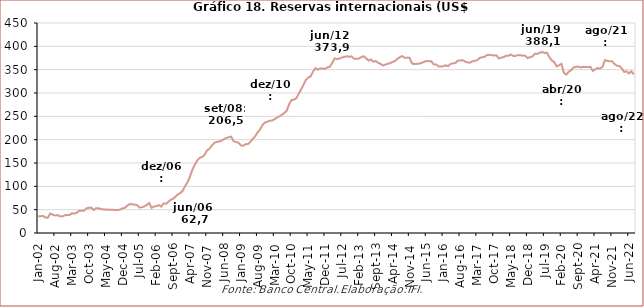
| Category | Reservas internacionais |
|---|---|
| 2002-01-01 | 36.167 |
| 2002-02-01 | 35.906 |
| 2002-03-01 | 36.721 |
| 2002-04-01 | 33.008 |
| 2002-05-01 | 32.889 |
| 2002-06-01 | 41.999 |
| 2002-07-01 | 39.06 |
| 2002-08-01 | 37.643 |
| 2002-09-01 | 38.381 |
| 2002-10-01 | 35.855 |
| 2002-11-01 | 35.592 |
| 2002-12-01 | 37.823 |
| 2003-01-01 | 38.772 |
| 2003-02-01 | 38.53 |
| 2003-03-01 | 42.335 |
| 2003-04-01 | 41.5 |
| 2003-05-01 | 43.373 |
| 2003-06-01 | 47.956 |
| 2003-07-01 | 47.645 |
| 2003-08-01 | 47.793 |
| 2003-09-01 | 52.675 |
| 2003-10-01 | 54.093 |
| 2003-11-01 | 54.427 |
| 2003-12-01 | 49.296 |
| 2004-01-01 | 53.261 |
| 2004-02-01 | 52.96 |
| 2004-03-01 | 51.612 |
| 2004-04-01 | 50.498 |
| 2004-05-01 | 50.54 |
| 2004-06-01 | 49.805 |
| 2004-07-01 | 49.666 |
| 2004-08-01 | 49.594 |
| 2004-09-01 | 49.496 |
| 2004-10-01 | 49.416 |
| 2004-11-01 | 50.133 |
| 2004-12-01 | 52.935 |
| 2005-01-01 | 54.022 |
| 2005-02-01 | 59.017 |
| 2005-03-01 | 61.96 |
| 2005-04-01 | 61.591 |
| 2005-05-01 | 60.709 |
| 2005-06-01 | 59.885 |
| 2005-07-01 | 54.688 |
| 2005-08-01 | 55.076 |
| 2005-09-01 | 57.008 |
| 2005-10-01 | 60.245 |
| 2005-11-01 | 64.277 |
| 2005-12-01 | 53.799 |
| 2006-01-01 | 56.924 |
| 2006-02-01 | 57.415 |
| 2006-03-01 | 59.824 |
| 2006-04-01 | 56.552 |
| 2006-05-01 | 63.381 |
| 2006-06-01 | 62.67 |
| 2006-07-01 | 66.819 |
| 2006-08-01 | 71.478 |
| 2006-09-01 | 73.393 |
| 2006-10-01 | 78.171 |
| 2006-11-01 | 83.114 |
| 2006-12-01 | 85.839 |
| 2007-01-01 | 91.086 |
| 2007-02-01 | 101.07 |
| 2007-03-01 | 109.531 |
| 2007-04-01 | 121.83 |
| 2007-05-01 | 136.419 |
| 2007-06-01 | 147.101 |
| 2007-07-01 | 155.91 |
| 2007-08-01 | 161.097 |
| 2007-09-01 | 162.962 |
| 2007-10-01 | 167.867 |
| 2007-11-01 | 177.06 |
| 2007-12-01 | 180.334 |
| 2008-01-01 | 187.507 |
| 2008-02-01 | 192.902 |
| 2008-03-01 | 195.232 |
| 2008-04-01 | 195.767 |
| 2008-05-01 | 197.906 |
| 2008-06-01 | 200.827 |
| 2008-07-01 | 203.562 |
| 2008-08-01 | 205.116 |
| 2008-09-01 | 206.494 |
| 2008-10-01 | 197.229 |
| 2008-11-01 | 194.668 |
| 2008-12-01 | 193.783 |
| 2009-01-01 | 188.102 |
| 2009-02-01 | 186.88 |
| 2009-03-01 | 190.388 |
| 2009-04-01 | 190.546 |
| 2009-05-01 | 195.264 |
| 2009-06-01 | 201.467 |
| 2009-07-01 | 207.363 |
| 2009-08-01 | 215.744 |
| 2009-09-01 | 221.629 |
| 2009-10-01 | 231.123 |
| 2009-11-01 | 236.66 |
| 2009-12-01 | 238.52 |
| 2010-01-01 | 240.484 |
| 2010-02-01 | 241.082 |
| 2010-03-01 | 243.762 |
| 2010-04-01 | 247.292 |
| 2010-05-01 | 249.846 |
| 2010-06-01 | 253.114 |
| 2010-07-01 | 257.299 |
| 2010-08-01 | 261.32 |
| 2010-09-01 | 275.206 |
| 2010-10-01 | 284.93 |
| 2010-11-01 | 285.461 |
| 2010-12-01 | 288.575 |
| 2011-01-01 | 297.696 |
| 2011-02-01 | 307.516 |
| 2011-03-01 | 317.146 |
| 2011-04-01 | 328.062 |
| 2011-05-01 | 333.017 |
| 2011-06-01 | 335.775 |
| 2011-07-01 | 346.144 |
| 2011-08-01 | 353.397 |
| 2011-09-01 | 349.708 |
| 2011-10-01 | 352.928 |
| 2011-11-01 | 352.073 |
| 2011-12-01 | 352.012 |
| 2012-01-01 | 355.075 |
| 2012-02-01 | 356.33 |
| 2012-03-01 | 365.216 |
| 2012-04-01 | 374.272 |
| 2012-05-01 | 372.409 |
| 2012-06-01 | 373.91 |
| 2012-07-01 | 376.154 |
| 2012-08-01 | 377.221 |
| 2012-09-01 | 378.726 |
| 2012-10-01 | 377.753 |
| 2012-11-01 | 378.56 |
| 2012-12-01 | 373.147 |
| 2013-01-01 | 373.417 |
| 2013-02-01 | 373.742 |
| 2013-03-01 | 376.934 |
| 2013-04-01 | 378.665 |
| 2013-05-01 | 374.417 |
| 2013-06-01 | 369.402 |
| 2013-07-01 | 371.966 |
| 2013-08-01 | 367.002 |
| 2013-09-01 | 368.654 |
| 2013-10-01 | 364.505 |
| 2013-11-01 | 362.41 |
| 2013-12-01 | 358.808 |
| 2014-01-01 | 360.936 |
| 2014-02-01 | 362.691 |
| 2014-03-01 | 363.914 |
| 2014-04-01 | 366.717 |
| 2014-05-01 | 368.752 |
| 2014-06-01 | 373.516 |
| 2014-07-01 | 376.792 |
| 2014-08-01 | 379.157 |
| 2014-09-01 | 375.513 |
| 2014-10-01 | 375.833 |
| 2014-11-01 | 375.426 |
| 2014-12-01 | 363.551 |
| 2015-01-01 | 361.767 |
| 2015-02-01 | 362.547 |
| 2015-03-01 | 362.744 |
| 2015-04-01 | 364.473 |
| 2015-05-01 | 366.647 |
| 2015-06-01 | 368.668 |
| 2015-07-01 | 368.252 |
| 2015-08-01 | 368.159 |
| 2015-09-01 | 361.37 |
| 2015-10-01 | 361.23 |
| 2015-11-01 | 357.016 |
| 2015-12-01 | 356.464 |
| 2016-01-01 | 357.507 |
| 2016-02-01 | 359.368 |
| 2016-03-01 | 357.698 |
| 2016-04-01 | 362.201 |
| 2016-05-01 | 363.447 |
| 2016-06-01 | 364.152 |
| 2016-07-01 | 369.34 |
| 2016-08-01 | 369.541 |
| 2016-09-01 | 370.417 |
| 2016-10-01 | 367.528 |
| 2016-11-01 | 365.556 |
| 2016-12-01 | 365.016 |
| 2017-01-01 | 367.708 |
| 2017-02-01 | 368.981 |
| 2017-03-01 | 370.111 |
| 2017-04-01 | 374.945 |
| 2017-05-01 | 376.491 |
| 2017-06-01 | 377.175 |
| 2017-07-01 | 381.029 |
| 2017-08-01 | 381.843 |
| 2017-09-01 | 381.244 |
| 2017-10-01 | 380.351 |
| 2017-11-01 | 381.056 |
| 2017-12-01 | 373.972 |
| 2018-01-01 | 375.701 |
| 2018-02-01 | 377.035 |
| 2018-03-01 | 379.577 |
| 2018-04-01 | 379.979 |
| 2018-05-01 | 382.549 |
| 2018-06-01 | 379.5 |
| 2018-07-01 | 379.444 |
| 2018-08-01 | 381.393 |
| 2018-09-01 | 380.738 |
| 2018-10-01 | 380.29 |
| 2018-11-01 | 379.722 |
| 2018-12-01 | 374.715 |
| 2019-01-01 | 376.984 |
| 2019-02-01 | 378.448 |
| 2019-03-01 | 384.165 |
| 2019-04-01 | 383.799 |
| 2019-05-01 | 386.162 |
| 2019-06-01 | 388.092 |
| 2019-07-01 | 385.73 |
| 2019-08-01 | 386.478 |
| 2019-09-01 | 376.434 |
| 2019-10-01 | 369.836 |
| 2019-11-01 | 366.376 |
| 2019-12-01 | 356.884 |
| 2020-01-01 | 359.394 |
| 2020-02-01 | 362.46 |
| 2020-03-01 | 343.165 |
| 2020-04-01 | 339.317 |
| 2020-05-01 | 345.706 |
| 2020-06-01 | 348.781 |
| 2020-07-01 | 354.664 |
| 2020-08-01 | 356.092 |
| 2020-09-01 | 356.606 |
| 2020-10-01 | 354.546 |
| 2020-11-01 | 356.004 |
| 2020-12-01 | 355.62 |
| 2021-01-01 | 355.416 |
| 2021-02-01 | 356.07 |
| 2021-03-01 | 347.413 |
| 2021-04-01 | 350.996 |
| 2021-05-01 | 353.448 |
| 2021-06-01 | 352.486 |
| 2021-07-01 | 355.671 |
| 2021-08-01 | 370.395 |
| 2021-09-01 | 368.886 |
| 2021-10-01 | 367.927 |
| 2021-11-01 | 367.772 |
| 2021-12-01 | 362.204 |
| 2022-01-01 | 358.398 |
| 2022-02-01 | 357.74 |
| 2022-03-01 | 353.169 |
| 2022-04-01 | 345.097 |
| 2022-05-01 | 346.415 |
| 2022-06-01 | 341.958 |
| 2022-07-01 | 346.403 |
| 2022-08-01 | 339.664 |